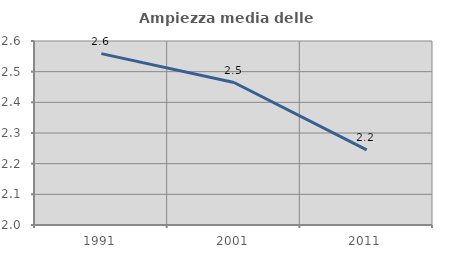
| Category | Ampiezza media delle famiglie |
|---|---|
| 1991.0 | 2.559 |
| 2001.0 | 2.465 |
| 2011.0 | 2.245 |